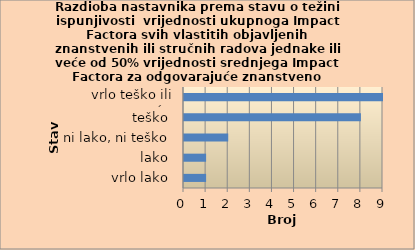
| Category | Series 0 |
|---|---|
| vrlo lako | 1 |
| lako | 1 |
| ni lako, ni teško | 2 |
| teško | 8 |
| vrlo teško ili nemoguće | 9 |